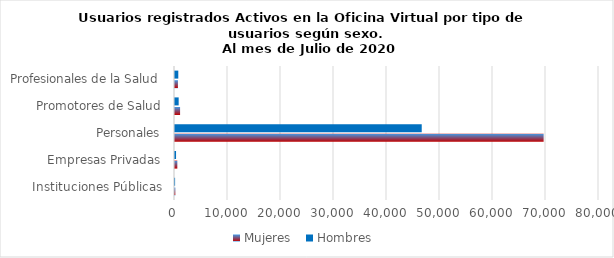
| Category | Mujeres | Hombres |
|---|---|---|
| Instituciones Públicas | 66 | 19 |
| Empresas Privadas | 439 | 198 |
| Personales | 69553 | 46552 |
| Promotores de Salud | 959 | 692 |
| Profesionales de la Salud | 552 | 621 |